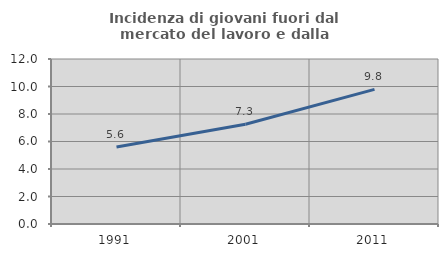
| Category | Incidenza di giovani fuori dal mercato del lavoro e dalla formazione  |
|---|---|
| 1991.0 | 5.597 |
| 2001.0 | 7.259 |
| 2011.0 | 9.788 |